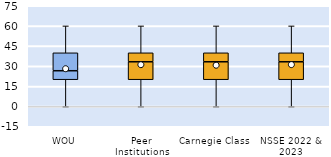
| Category | 25th | 50th | 75th |
|---|---|---|---|
| WOU | 20 | 6.667 | 13.333 |
| Peer Institutions | 20 | 13.333 | 6.667 |
| Carnegie Class | 20 | 13.333 | 6.667 |
| NSSE 2022 & 2023 | 20 | 13.333 | 6.667 |